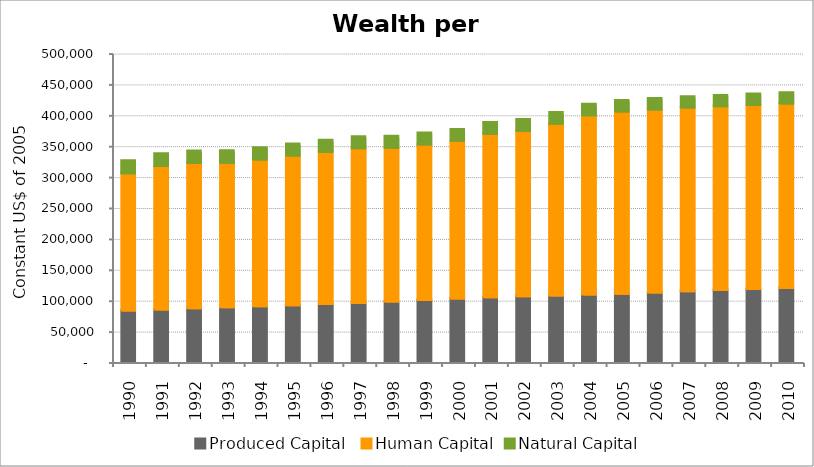
| Category | Produced Capital  | Human Capital | Natural Capital |
|---|---|---|---|
| 1990.0 | 83199.396 | 222166.389 | 20146.804 |
| 1991.0 | 85031.796 | 232083.476 | 19808.84 |
| 1992.0 | 86927.155 | 235050.504 | 19511.791 |
| 1993.0 | 88437.338 | 234107.654 | 19249.554 |
| 1994.0 | 90149.53 | 237541.149 | 19012.628 |
| 1995.0 | 91880.753 | 242107.177 | 18807.688 |
| 1996.0 | 93661.523 | 246350.547 | 18642.353 |
| 1997.0 | 95570.968 | 250390.861 | 18515.377 |
| 1998.0 | 97739.394 | 249124.733 | 18421.367 |
| 1999.0 | 100127.025 | 251930.144 | 18321.23 |
| 2000.0 | 102564.314 | 255575.79 | 18225.926 |
| 2001.0 | 104655.943 | 264656.735 | 18119.971 |
| 2002.0 | 106262.167 | 268091.134 | 18007.493 |
| 2003.0 | 107722.226 | 277916.164 | 17900.947 |
| 2004.0 | 109121.867 | 290045.768 | 17796.328 |
| 2005.0 | 110539.476 | 294852.939 | 17699.31 |
| 2006.0 | 112407.277 | 296207.877 | 17601.691 |
| 2007.0 | 114518.428 | 297302.135 | 17512.282 |
| 2008.0 | 116686.394 | 297242.204 | 17431.464 |
| 2009.0 | 118059.178 | 298046.139 | 17361.28 |
| 2010.0 | 119755.49 | 298607.58 | 17291.964 |